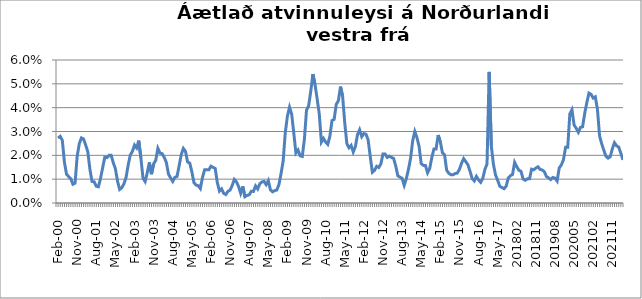
| Category | Series 0 |
|---|---|
| feb.00 | 0.027 |
| mar.00 | 0.028 |
| apr.00 | 0.026 |
| maí.00 | 0.017 |
| jún.00 | 0.012 |
| júl.00 | 0.011 |
| ágú.00 | 0.01 |
| sep.00 | 0.008 |
| okt.00 | 0.008 |
| nóv.00 | 0.02 |
| des.00 | 0.025 |
| jan.01 | 0.027 |
| feb.01 | 0.027 |
| mar.01 | 0.024 |
| apr.01 | 0.022 |
| maí.01 | 0.014 |
| jún.01 | 0.009 |
| júl.01 | 0.009 |
| ágú.01 | 0.007 |
| sep.01 | 0.007 |
| okt.01 | 0.01 |
| nóv.01 | 0.015 |
| des.01 | 0.019 |
| jan.02 | 0.019 |
| feb.02 | 0.02 |
| mar.02 | 0.02 |
| apr.02 | 0.017 |
| maí.02 | 0.014 |
| jún.02 | 0.009 |
| júl.02 | 0.006 |
| ágú.02 | 0.006 |
| sep.02 | 0.008 |
| okt.02 | 0.011 |
| nóv.02 | 0.016 |
| des.02 | 0.02 |
| jan.03 | 0.022 |
| feb.03 | 0.024 |
| mar.03 | 0.023 |
| apr.03 | 0.026 |
| maí.03 | 0.019 |
| jún.03 | 0.01 |
| júl.03 | 0.009 |
| ágú.03 | 0.013 |
| sep.03 | 0.017 |
| okt.03 | 0.012 |
| nóv.03 | 0.016 |
| des.03 | 0.018 |
| jan.04 | 0.023 |
| feb.04 | 0.021 |
| mar.04 | 0.021 |
| apr.04 | 0.019 |
| maí.04 | 0.017 |
| jún.04 | 0.012 |
| júl.04 | 0.011 |
| ágú.04 | 0.009 |
| sep.04 | 0.011 |
| okt.04 | 0.011 |
| nóv.04 | 0.016 |
| des.04 | 0.02 |
| jan.05 | 0.023 |
| feb.05 | 0.022 |
| mar.05 | 0.017 |
| apr.05 | 0.017 |
| maí.05 | 0.013 |
| jún.05 | 0.009 |
| júl.05 | 0.008 |
| ágú.05 | 0.007 |
| sep.05 | 0.006 |
| okt.05 | 0.011 |
| nóv.05 | 0.014 |
| des.05 | 0.014 |
| jan.06 | 0.014 |
| feb.06 | 0.015 |
| mar.06 | 0.015 |
| apr.06 | 0.014 |
| maí.06 | 0.009 |
| jún.06 | 0.005 |
| júl.06 | 0.006 |
| ágú.06 | 0.004 |
| sep.06 | 0.004 |
| okt.06 | 0.005 |
| nóv.06 | 0.005 |
| des.06 | 0.007 |
| jan.07 | 0.01 |
| feb.07 | 0.009 |
| mar.07 | 0.007 |
| apr.07 | 0.004 |
| maí.07 | 0.007 |
| jún.07 | 0.003 |
| júl.07 | 0.003 |
| ágú.07 | 0.003 |
| sep.07 | 0.005 |
| okt.07 | 0.005 |
| nóv.07 | 0.007 |
| des.07 | 0.006 |
| jan.08 | 0.008 |
| feb.08 | 0.009 |
| mar.08 | 0.009 |
| apr.08 | 0.008 |
| maí.08 | 0.009 |
| jún.08 | 0.006 |
| júl.08 | 0.005 |
| ágú.08 | 0.005 |
| sep.08 | 0.005 |
| okt.08 | 0.008 |
| nóv.08 | 0.012 |
| des.08 | 0.018 |
| jan.09 | 0.03 |
| feb.09 | 0.036 |
| mar.09 | 0.04 |
| apr.09 | 0.037 |
| maí.09 | 0.029 |
| jún.09 | 0.021 |
| júl.09 | 0.022 |
| ágú.09 | 0.02 |
| sep.09 | 0.02 |
| okt.09 | 0.027 |
| nóv.09 | 0.039 |
| des.09 | 0.041 |
| jan.10 | 0.047 |
| feb.10 | 0.054 |
| mar.10 | 0.05 |
| apr.10 | 0.044 |
| maí.10 | 0.037 |
| jún.10 | 0.026 |
| júl.10 | 0.027 |
| ágú.10 | 0.026 |
| sep.10 | 0.025 |
| okt.10 | 0.028 |
| nóv.10 | 0.035 |
| des.10 | 0.035 |
| jan.11 | 0.041 |
| feb.11 | 0.043 |
| mar.11 | 0.049 |
| apr.11 | 0.045 |
| maí.11 | 0.034 |
| jún.11 | 0.025 |
| júl.11 | 0.023 |
| ágú.11 | 0.024 |
| sep.11 | 0.021 |
| okt.11 | 0.024 |
| nóv.11 | 0.029 |
| des.11 | 0.031 |
| jan.12 | 0.028 |
| feb.12 | 0.029 |
| mar.12 | 0.029 |
| apr.12 | 0.027 |
| maí.12 | 0.02 |
| jún.12 | 0.013 |
| júl.12 | 0.014 |
| ágú.12 | 0.015 |
| sep.12 | 0.015 |
| okt.12 | 0.016 |
| nóv.12 | 0.021 |
| des.12 | 0.021 |
| jan.13 | 0.019 |
| feb.13 | 0.02 |
| mar.13 | 0.019 |
| apr.13 | 0.019 |
| maí.13 | 0.016 |
| jún.13 | 0.011 |
| júl.13 | 0.011 |
| ágú.13 | 0.01 |
| sep.13 | 0.007 |
| okt.13 | 0.01 |
| nóv.13 | 0.014 |
| des.13 | 0.019 |
| jan.14* | 0.026 |
| feb.14 | 0.03 |
| mar.14 | 0.027 |
| apr.14 | 0.024 |
| maí.14 | 0.017 |
| jún.14 | 0.016 |
| júl.14 | 0.016 |
| ágú.14 | 0.013 |
| sep.14 | 0.014 |
| okt.14 | 0.019 |
| nóv.14 | 0.023 |
| des.14 | 0.023 |
| jan.15 | 0.029 |
| feb.15 | 0.026 |
| mar.15 | 0.021 |
| apr.15 | 0.02 |
| maí.15 | 0.014 |
| jún.15 | 0.012 |
| júl.15 | 0.012 |
| ágú.15 | 0.012 |
| sep.15 | 0.012 |
| okt.15 | 0.013 |
| nóv.15 | 0.014 |
| des.15 | 0.017 |
| jan.16 | 0.019 |
| feb.16 | 0.017 |
| mar.16 | 0.016 |
| apr.16 | 0.013 |
| maí.16 | 0.01 |
| jún.16 | 0.009 |
| júl.16 | 0.011 |
| ágú.16 | 0.01 |
| sep.16 | 0.009 |
| okt.16 | 0.01 |
| nóv.16 | 0.014 |
| des.16 | 0.016 |
| jan.17 | 0.055 |
| feb.17 | 0.024 |
| mar.17 | 0.016 |
| apr.17 | 0.012 |
| maí.17 | 0.01 |
| jún.17 | 0.007 |
| júl.17 | 0.007 |
| ágú.17 | 0.006 |
| sep.17 | 0.007 |
| 201710 | 0.01 |
| 201711 | 0.011 |
| 201712 | 0.012 |
| 201801 | 0.017 |
| 201802 | 0.015 |
| 201803 | 0.014 |
| 201804 | 0.013 |
| 201805 | 0.01 |
| 201806 | 0.01 |
| 201807 | 0.01 |
| 201808 | 0.01 |
| 201809 | 0.014 |
| 201810 | 0.014 |
| 201811 | 0.015 |
| 201812 | 0.015 |
| 201901 | 0.014 |
| 201902 | 0.014 |
| 201903 | 0.013 |
| 201904 | 0.011 |
| 201905 | 0.011 |
| 201906 | 0.01 |
| 201907 | 0.011 |
| 201908 | 0.01 |
| 201909 | 0.009 |
| 201910 | 0.015 |
| 201911 | 0.016 |
| 201912 | 0.018 |
| 202001 | 0.023 |
| 202002 | 0.023 |
| 202003 | 0.037 |
| 202004 | 0.039 |
| 202005 | 0.033 |
| 202006 | 0.031 |
| 202007 | 0.03 |
| 202008 | 0.032 |
| 202009 | 0.032 |
| 202010 | 0.038 |
| 202011 | 0.042 |
| 202012 | 0.046 |
| 202101 | 0.046 |
| 202102 | 0.044 |
| 202103 | 0.045 |
| 202104 | 0.039 |
| 202105 | 0.028 |
| 202106 | 0.025 |
| 202107 | 0.022 |
| 202108 | 0.02 |
| 202109 | 0.019 |
| 202110 | 0.019 |
| 202111 | 0.023 |
| 202112 | 0.025 |
| 202201 | 0.024 |
| 202202 | 0.023 |
| 202203 | 0.021 |
| 202204 | 0.018 |